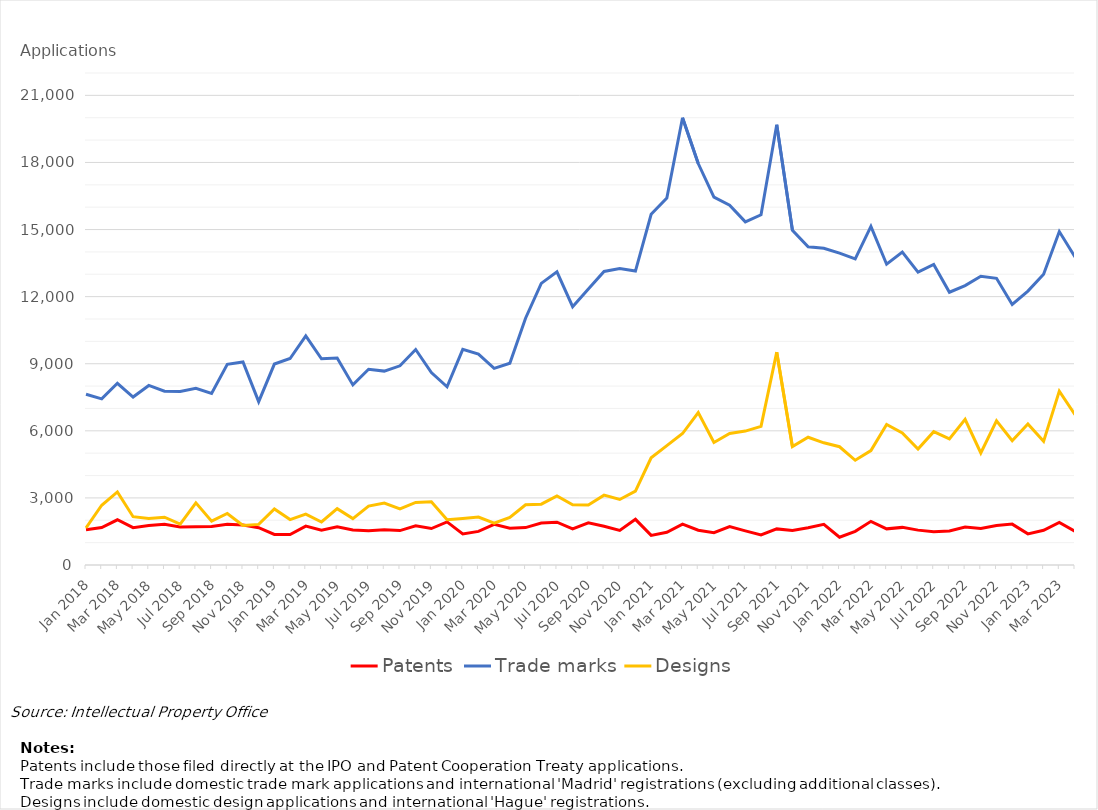
| Category | Patents | Trade marks | Designs |
|---|---|---|---|
| Jan 2018 | 1575 | 7634 | 1658 |
| Feb 2018 | 1676 | 7428 | 2672 |
| Mar 2018 | 2022 | 8127 | 3267 |
| Apr 2018 | 1670 | 7512 | 2160 |
| May 2018 | 1767 | 8030 | 2083 |
| Jun 2018 | 1821 | 7769 | 2136 |
| Jul 2018 | 1704 | 7757 | 1832 |
| Aug 2018 | 1713 | 7897 | 2777 |
| Sep 2018 | 1725 | 7673 | 1960 |
| Oct 2018 | 1818 | 8972 | 2302 |
| Nov 2018 | 1787 | 9076 | 1765 |
| Dec 2018 | 1670 | 7304 | 1815 |
| Jan 2019 | 1367 | 8985 | 2505 |
| Feb 2019 | 1361 | 9234 | 2031 |
| Mar 2019 | 1737 | 10243 | 2274 |
| Apr 2019 | 1552 | 9219 | 1923 |
| May 2019 | 1710 | 9251 | 2520 |
| Jun 2019 | 1569 | 8053 | 2074 |
| Jul 2019 | 1527 | 8752 | 2634 |
| Aug 2019 | 1571 | 8670 | 2768 |
| Sep 2019 | 1540 | 8907 | 2511 |
| Oct 2019 | 1755 | 9636 | 2800 |
| Nov 2019 | 1630 | 8607 | 2827 |
| Dec 2019 | 1926 | 7970 | 2028 |
| Jan 2020 | 1391 | 9642 | 2082 |
| Feb 2020 | 1504 | 9428 | 2143 |
| Mar 2020 | 1819 | 8794 | 1872 |
| Apr 2020 | 1648 | 9021 | 2127 |
| May 2020 | 1672 | 11035 | 2695 |
| Jun 2020 | 1879 | 12593 | 2721 |
| Jul 2020 | 1912 | 13110 | 3086 |
| Aug 2020 | 1613 | 11551 | 2695 |
| Sep 2020 | 1886 | 12340 | 2686 |
| Oct 2020 | 1730 | 13126 | 3124 |
| Nov 2020 | 1547 | 13254 | 2930 |
| Dec 2020 | 2042 | 13144 | 3302 |
| Jan 2021 | 1324 | 15685 | 4792 |
| Feb 2021 | 1462 | 16413 | 5340 |
| Mar 2021 | 1828 | 20001 | 5878 |
| Apr 2021 | 1554 | 17951 | 6815 |
| May 2021 | 1446 | 16446 | 5480 |
| Jun 2021 | 1716 | 16091 | 5881 |
| Jul 2021 | 1528 | 15345 | 5989 |
| Aug 2021 | 1344 | 15659 | 6200 |
| Sep 2021 | 1615 | 19685 | 9517 |
| Oct 2021 | 1547 | 14968 | 5292 |
| Nov 2021 | 1670 | 14232 | 5712 |
| Dec 2021 | 1818 | 14162 | 5464 |
| Jan 2022 | 1240 | 13946 | 5288 |
| Feb 2022 | 1505 | 13691 | 4683 |
| Mar 2022 | 1952 | 15142 | 5114 |
| Apr 2022 | 1616 | 13450 | 6282 |
| May 2022 | 1682 | 13992 | 5907 |
| Jun 2022 | 1559 | 13095 | 5183 |
| Jul 2022 | 1485 | 13439 | 5963 |
| Aug 2022 | 1520 | 12197 | 5639 |
| Sep 2022 | 1702 | 12493 | 6515 |
| Oct 2022 | 1630 | 12914 | 5012 |
| Nov 2022 | 1770 | 12819 | 6446 |
| Dec 2022 | 1828 | 11650 | 5558 |
| Jan 2023 | 1392 | 12250 | 6307 |
| Feb 2023 | 1550 | 13001 | 5529 |
| Mar 2023 | 1908 | 14909 | 7777 |
| Apr 2023 | 1506 | 13770 | 6726 |